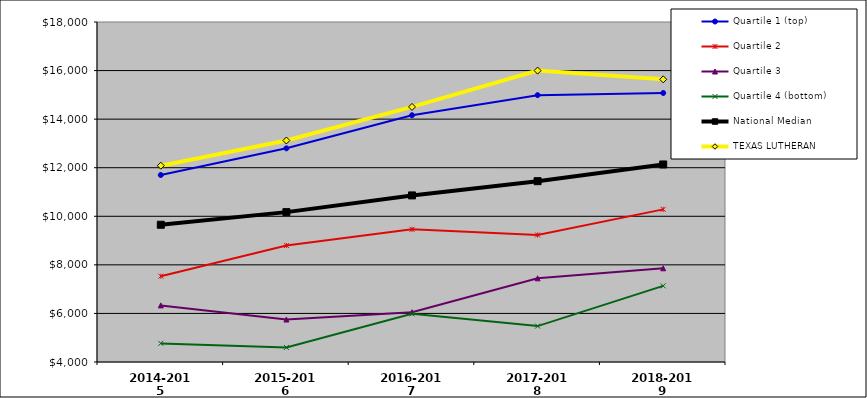
| Category | Quartile 1 (top) | Quartile 2 | Quartile 3 | Quartile 4 (bottom) | National Median | TEXAS LUTHERAN |
|---|---|---|---|---|---|---|
| 2014-2015 | 11699.398 | 7531.646 | 6331.289 | 4766.084 | 9651.331 | 12082.598 |
| 2015-2016 | 12797.709 | 8797.575 | 5749.023 | 4599.934 | 10170.953 | 13120.524 |
| 2016-2017 | 14161.796 | 9462.922 | 6050.359 | 5986.332 | 10859.41 | 14503.602 |
| 2017-2018 | 14987.903 | 9230.261 | 7444.726 | 5478.561 | 11445.61 | 15999.237 |
| 2018-2019 | 15077.512 | 10284.842 | 7858.89 | 7135.055 | 12133.725 | 15639.308 |